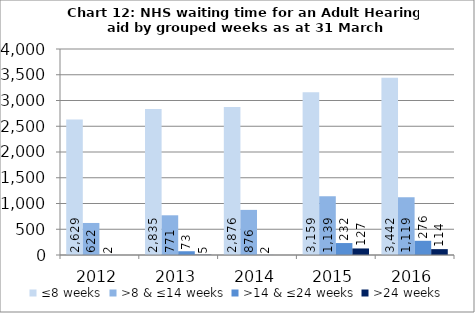
| Category | ≤8 weeks | >8 & ≤14 weeks | >14 & ≤24 weeks | >24 weeks |
|---|---|---|---|---|
| 2012.0 | 2629 | 622 | 2 | 0 |
| 2013.0 | 2835 | 771 | 73 | 5 |
| 2014.0 | 2876 | 876 | 2 | 0 |
| 2015.0 | 3159 | 1139 | 232 | 127 |
| 2016.0 | 3442 | 1119 | 276 | 114 |